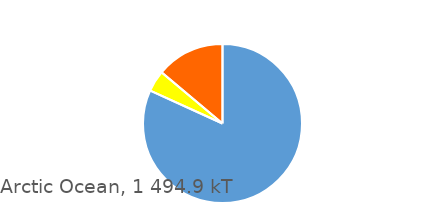
| Category | Arctic Ocean |
|---|---|
| 0 | 1222867 |
| 1 | 64541 |
| 2 | 207479 |